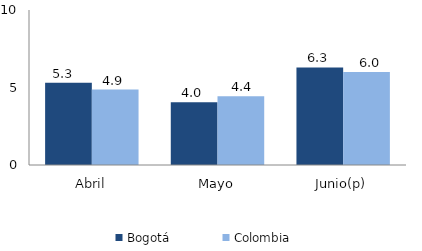
| Category | Bogotá | Colombia |
|---|---|---|
| Abril | 5.31 | 4.868 |
| Mayo | 4.049 | 4.443 |
| Junio(p) | 6.291 | 5.992 |